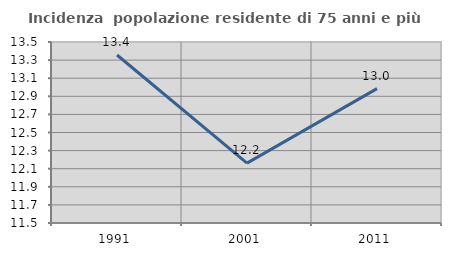
| Category | Incidenza  popolazione residente di 75 anni e più |
|---|---|
| 1991.0 | 13.356 |
| 2001.0 | 12.162 |
| 2011.0 | 12.985 |